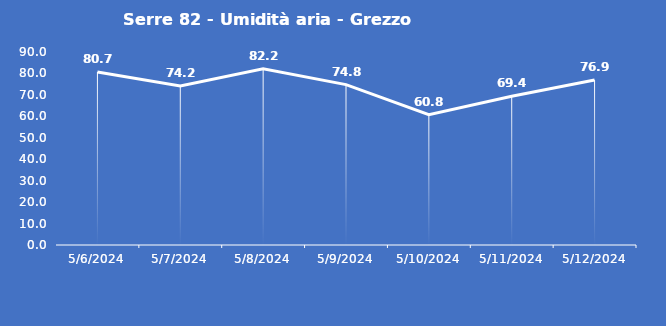
| Category | Serre 82 - Umidità aria - Grezzo (%) |
|---|---|
| 5/6/24 | 80.7 |
| 5/7/24 | 74.2 |
| 5/8/24 | 82.2 |
| 5/9/24 | 74.8 |
| 5/10/24 | 60.8 |
| 5/11/24 | 69.4 |
| 5/12/24 | 76.9 |